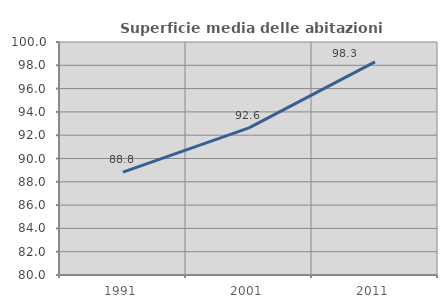
| Category | Superficie media delle abitazioni occupate |
|---|---|
| 1991.0 | 88.825 |
| 2001.0 | 92.631 |
| 2011.0 | 98.3 |